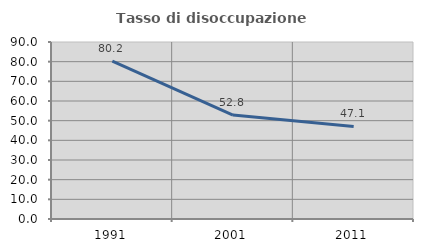
| Category | Tasso di disoccupazione giovanile  |
|---|---|
| 1991.0 | 80.24 |
| 2001.0 | 52.846 |
| 2011.0 | 47.059 |